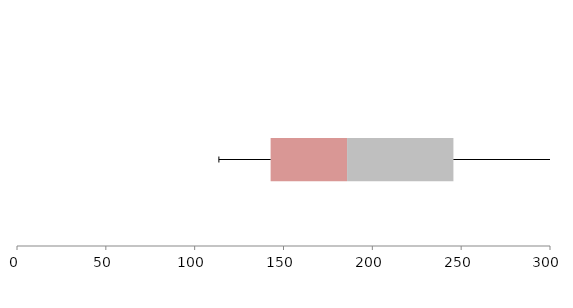
| Category | Series 1 | Series 2 | Series 3 |
|---|---|---|---|
| 0 | 142.753 | 43.032 | 59.853 |